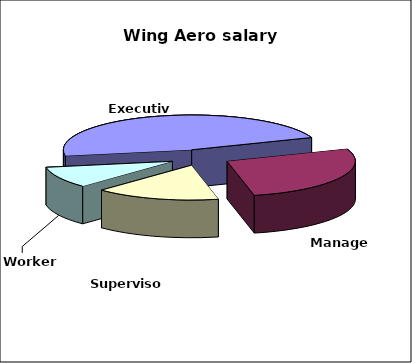
| Category | Total salary ($K) |
|---|---|
| Executive | 1089 |
| Manager | 633 |
| Supervisor | 364 |
| Worker | 229 |